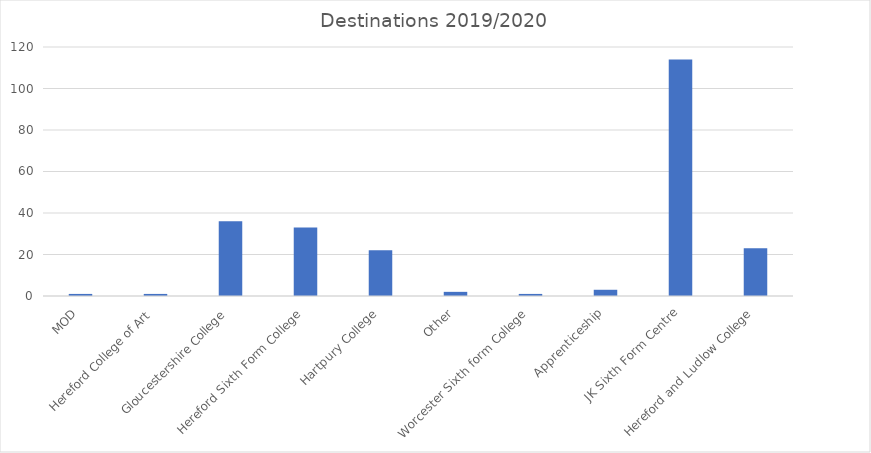
| Category | Series 0 |
|---|---|
| MOD | 1 |
| Hereford College of Art | 1 |
| Gloucestershire College | 36 |
| Hereford Sixth Form College | 33 |
| Hartpury College | 22 |
| Other | 2 |
| Worcester Sixth form College | 1 |
| Apprenticeship | 3 |
| JK Sixth Form Centre | 114 |
| Hereford and Ludlow College | 23 |